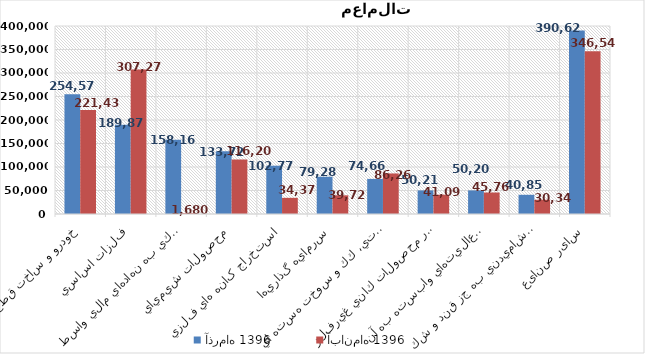
| Category | آذر‌ماه 1396 | آبان‌ماه 1396 |
|---|---|---|
| خودرو و ساخت قطعات | 254578 | 221435 |
| فلزات اساسي | 189870 | 307279 |
| فعاليتهاي كمكي به نهادهاي مالي واسط | 158167 | 1680 |
| محصولات شيميايي | 133729 | 116208 |
| استخراج کانه هاي فلزي | 102774 | 34374 |
| سرمايه گذاريها | 79284 | 39724 |
| فراورده هاي نفتي، كك و سوخت هسته اي | 74663 | 86265 |
| ساير محصولات كاني غيرفلزي | 50217 | 41099 |
| رايانه و فعاليت‌هاي وابسته به آن | 50203 | 45763 |
| محصولات غذايي و آشاميدني به جز قند و شكر | 40857 | 30349 |
| سایر صنایع | 390624 | 346542 |